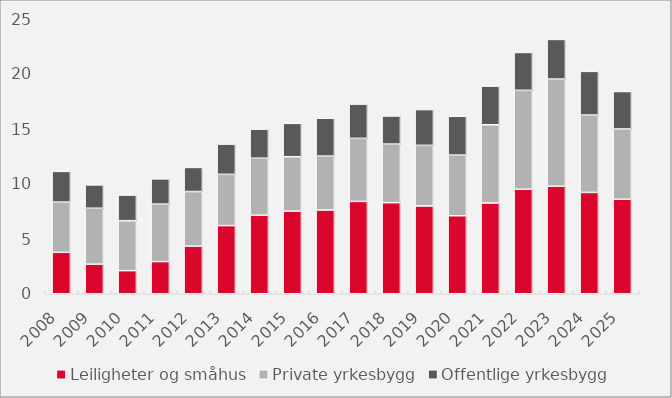
| Category | Leiligheter og småhus | Private yrkesbygg | Offentlige yrkesbygg |
|---|---|---|---|
| 2008.0 | 3.767 | 4.567 | 2.792 |
| 2009.0 | 2.686 | 5.086 | 2.125 |
| 2010.0 | 2.104 | 4.541 | 2.331 |
| 2011.0 | 2.925 | 5.226 | 2.294 |
| 2012.0 | 4.327 | 4.964 | 2.193 |
| 2013.0 | 6.197 | 4.659 | 2.75 |
| 2014.0 | 7.14 | 5.183 | 2.643 |
| 2015.0 | 7.509 | 4.95 | 3.035 |
| 2016.0 | 7.615 | 4.899 | 3.447 |
| 2017.0 | 8.396 | 5.73 | 3.118 |
| 2018.0 | 8.281 | 5.324 | 2.558 |
| 2019.0 | 7.98 | 5.511 | 3.253 |
| 2020.0 | 7.095 | 5.511 | 3.529 |
| 2021.0 | 8.252 | 7.11 | 3.514 |
| 2022.0 | 9.498 | 8.994 | 3.443 |
| 2023.0 | 9.774 | 9.741 | 3.607 |
| 2024.0 | 9.21 | 7.033 | 3.975 |
| 2025.0 | 8.589 | 6.39 | 3.406 |